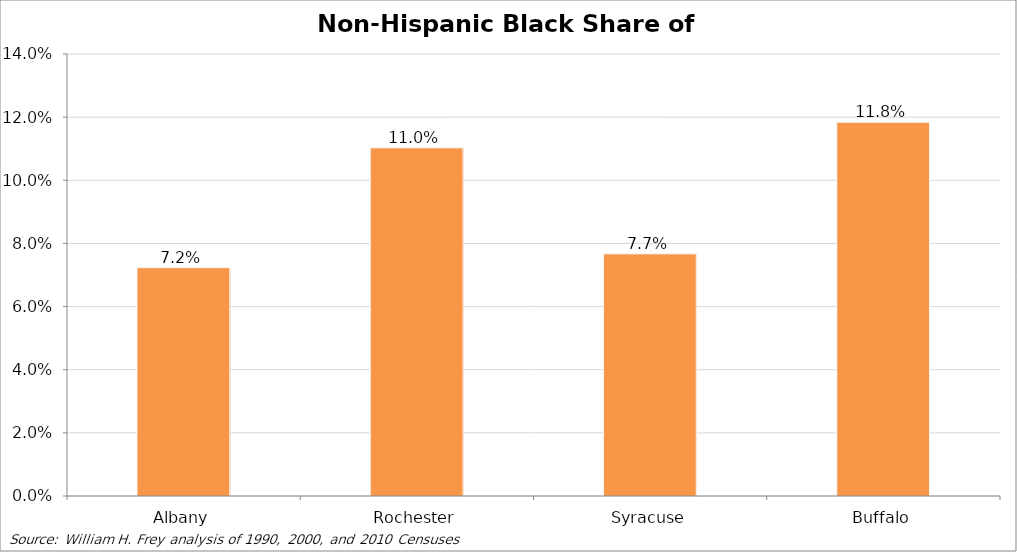
| Category | Non-Hispanic Black Share of Population |
|---|---|
| Albany | 0.072 |
| Rochester | 0.11 |
| Syracuse | 0.077 |
| Buffalo | 0.118 |